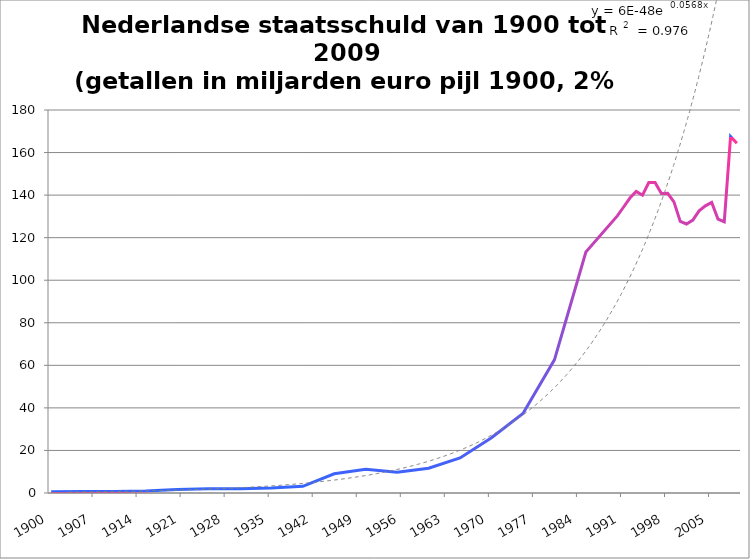
| Category | mld eur (incl inflatie) |
|---|---|
| 1900.0 | 0.642 |
| 1905.0 | 0.67 |
| 1910.0 | 0.691 |
| 1915.0 | 0.93 |
| 1920.0 | 1.621 |
| 1925.0 | 2.046 |
| 1930.0 | 2.014 |
| 1935.0 | 2.4 |
| 1940.0 | 3.139 |
| 1945.0 | 9.05 |
| 1950.0 | 11.117 |
| 1955.0 | 9.784 |
| 1960.0 | 11.611 |
| 1965.0 | 16.486 |
| 1970.0 | 25.947 |
| 1975.0 | 37.338 |
| 1980.0 | 62.602 |
| 1985.0 | 113.23 |
| 1990.0 | 130.23 |
| 1991.0 | 134.411 |
| 1992.0 | 138.635 |
| 1993.0 | 141.716 |
| 1994.0 | 139.946 |
| 1995.0 | 145.923 |
| 1996.0 | 145.911 |
| 1997.0 | 140.805 |
| 1998.0 | 140.864 |
| 1999.0 | 136.83 |
| 2000.0 | 127.661 |
| 2001.0 | 126.425 |
| 2002.0 | 128.238 |
| 2003.0 | 132.579 |
| 2004.0 | 134.954 |
| 2005.0 | 136.597 |
| 2006.0 | 128.761 |
| 2007.0 | 127.505 |
| 2008.0 | 167.524 |
| 2009.0 | 164.331 |